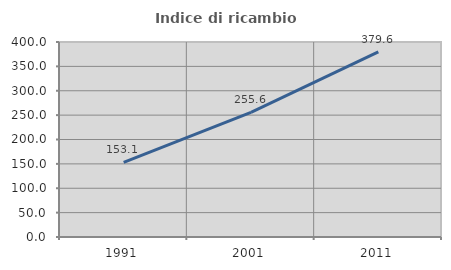
| Category | Indice di ricambio occupazionale  |
|---|---|
| 1991.0 | 153.078 |
| 2001.0 | 255.556 |
| 2011.0 | 379.619 |